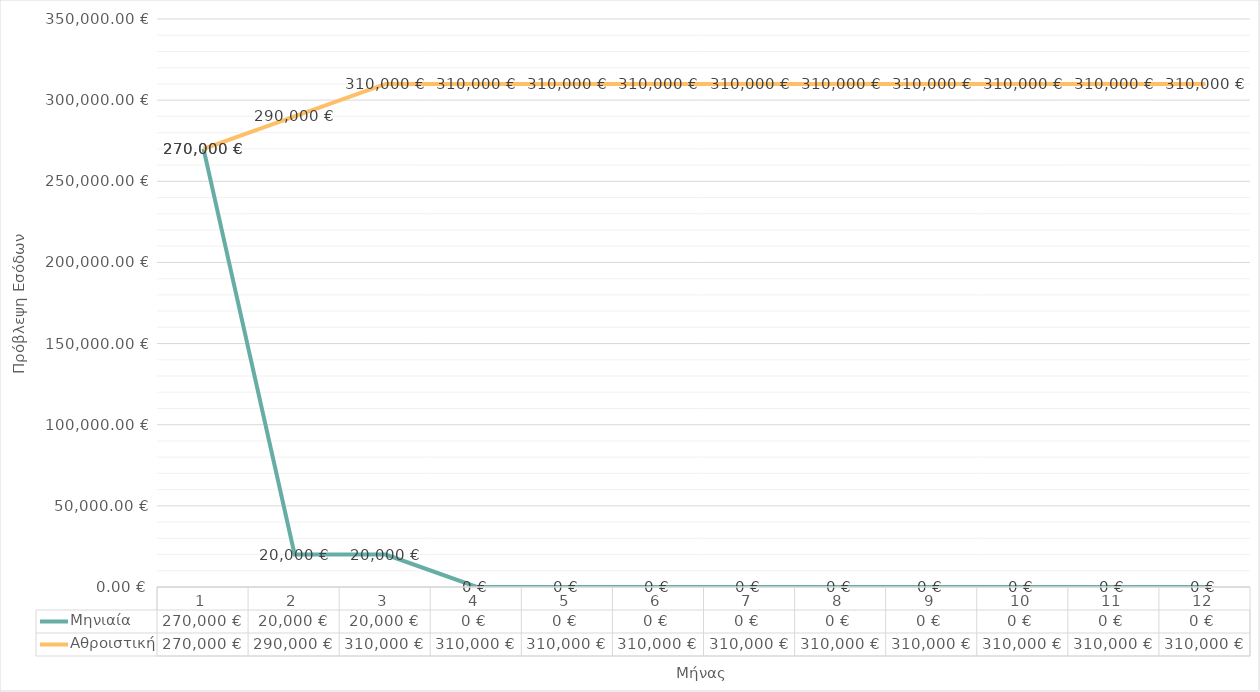
| Category | Μηνιαία | Αθροιστική |
|---|---|---|
| 0 | 270000 | 270000 |
| 1 | 20000 | 290000 |
| 2 | 20000 | 310000 |
| 3 | 0 | 310000 |
| 4 | 0 | 310000 |
| 5 | 0 | 310000 |
| 6 | 0 | 310000 |
| 7 | 0 | 310000 |
| 8 | 0 | 310000 |
| 9 | 0 | 310000 |
| 10 | 0 | 310000 |
| 11 | 0 | 310000 |